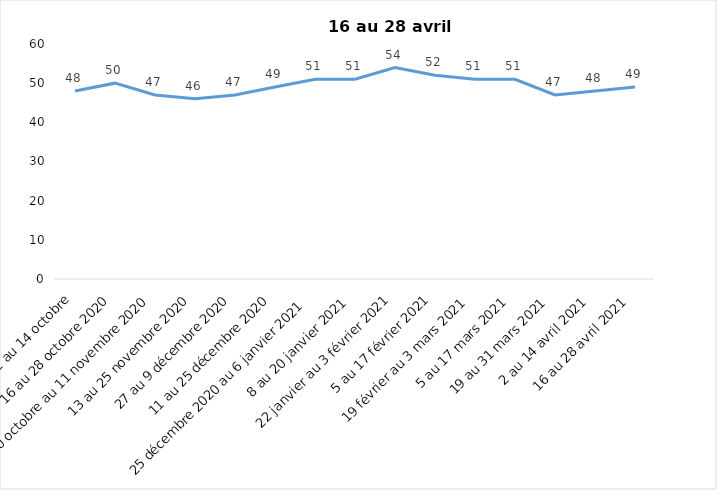
| Category | Toujours aux trois mesures |
|---|---|
| 2 au 14 octobre | 48 |
| 16 au 28 octobre 2020 | 50 |
| 30 octobre au 11 novembre 2020 | 47 |
| 13 au 25 novembre 2020 | 46 |
| 27 au 9 décembre 2020 | 47 |
| 11 au 25 décembre 2020 | 49 |
| 25 décembre 2020 au 6 janvier 2021 | 51 |
| 8 au 20 janvier 2021 | 51 |
| 22 janvier au 3 février 2021 | 54 |
| 5 au 17 février 2021 | 52 |
| 19 février au 3 mars 2021 | 51 |
| 5 au 17 mars 2021 | 51 |
| 19 au 31 mars 2021 | 47 |
| 2 au 14 avril 2021 | 48 |
| 16 au 28 avril 2021 | 49 |